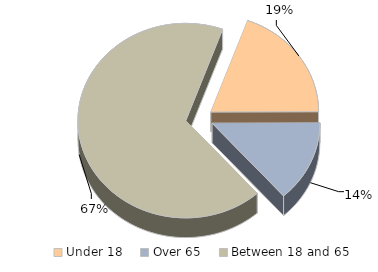
| Category | New York |
|---|---|
| Under 18  | 0.194 |
| Over 65  | 0.135 |
| Between 18 and 65 | 0.671 |